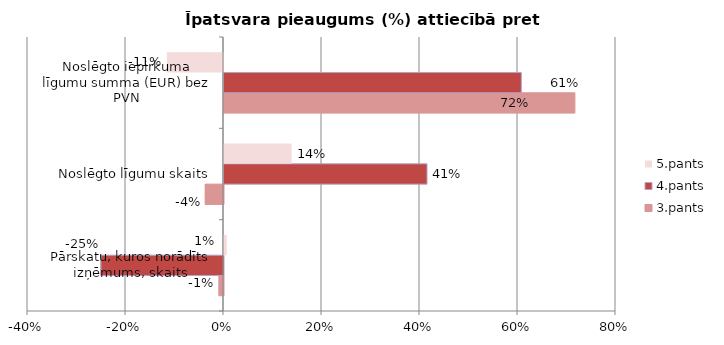
| Category | 3.pants | 4.pants | 5.pants |
|---|---|---|---|
| Pārskatu, kuros norādīts izņēmums, skaits | -0.009 | -0.25 | 0.006 |
| Noslēgto līgumu skaits | -0.037 | 0.414 | 0.138 |
| Noslēgto iepirkuma līgumu summa (EUR) bez PVN | 0.716 | 0.607 | -0.114 |